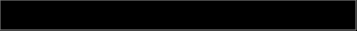
| Category | Series 0 |
|---|---|
| 0 | 0.358 |
| 1 | 0.032 |
| 2 | 0.187 |
| 3 | 0.368 |
| 4 | 0.055 |